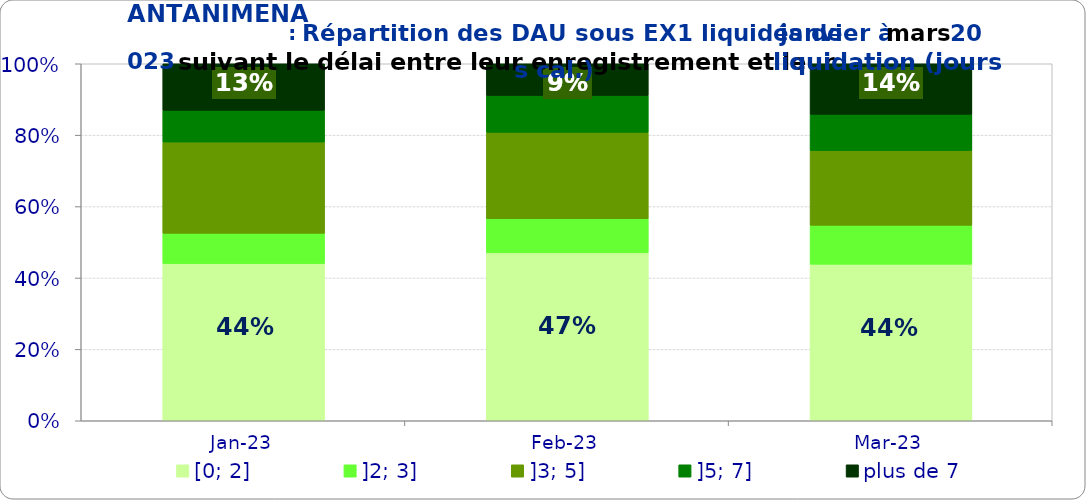
| Category | [0; 2] | ]2; 3] | ]3; 5] | ]5; 7] | plus de 7 |
|---|---|---|---|---|---|
| 2023-01-01 | 0.44 | 0.085 | 0.256 | 0.089 | 0.131 |
| 2023-02-01 | 0.47 | 0.096 | 0.242 | 0.103 | 0.089 |
| 2023-03-01 | 0.439 | 0.109 | 0.209 | 0.101 | 0.142 |